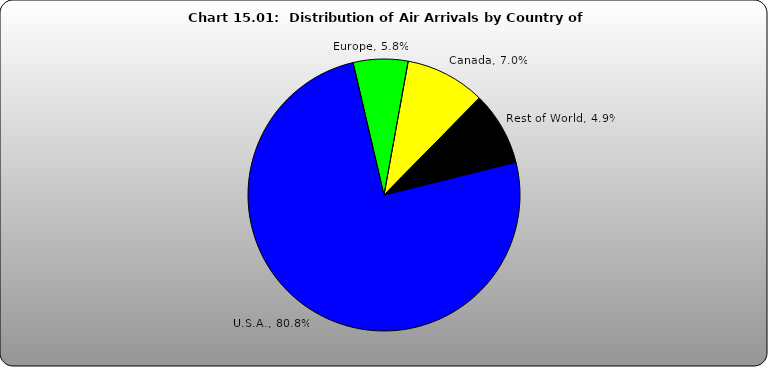
| Category | Series 0 |
|---|---|
| 0 | 75.235 |
| 1 | 6.505 |
| 2 | 9.509 |
| 3 | 8.751 |